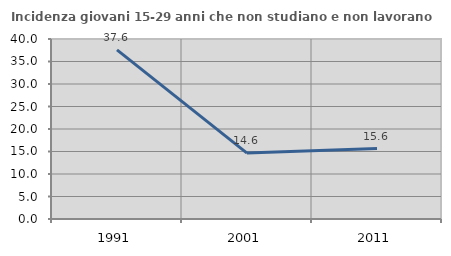
| Category | Incidenza giovani 15-29 anni che non studiano e non lavorano  |
|---|---|
| 1991.0 | 37.59 |
| 2001.0 | 14.64 |
| 2011.0 | 15.644 |